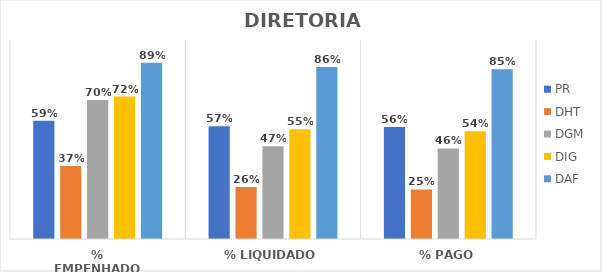
| Category | PR | DHT | DGM | DIG | DAF |
|---|---|---|---|---|---|
| % EMPENHADO | 0.595 | 0.367 | 0.699 | 0.716 | 0.885 |
| % LIQUIDADO | 0.566 | 0.262 | 0.466 | 0.551 | 0.864 |
| % PAGO | 0.563 | 0.249 | 0.455 | 0.542 | 0.853 |